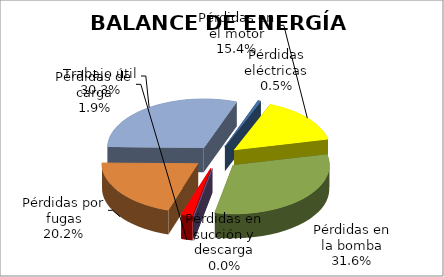
| Category | 3.4  BALANCE DE ENERGIA ACTUAL |
|---|---|
| Pérdidas eléctricas | 1133.766 |
| Pérdidas en el motor | 33060.34 |
| Pérdidas en la bomba | 67928.628 |
| Pérdidas en succión y descarga | 94.718 |
| Pérdidas de carga | 4097.636 |
| Pérdidas por fugas | 43484.082 |
| Trabajo útil | 65226.123 |